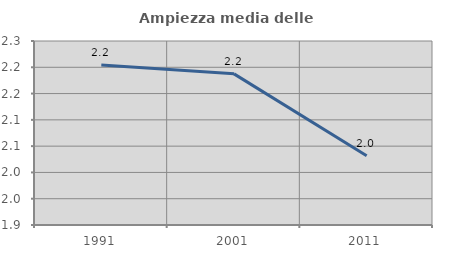
| Category | Ampiezza media delle famiglie |
|---|---|
| 1991.0 | 2.204 |
| 2001.0 | 2.188 |
| 2011.0 | 2.032 |